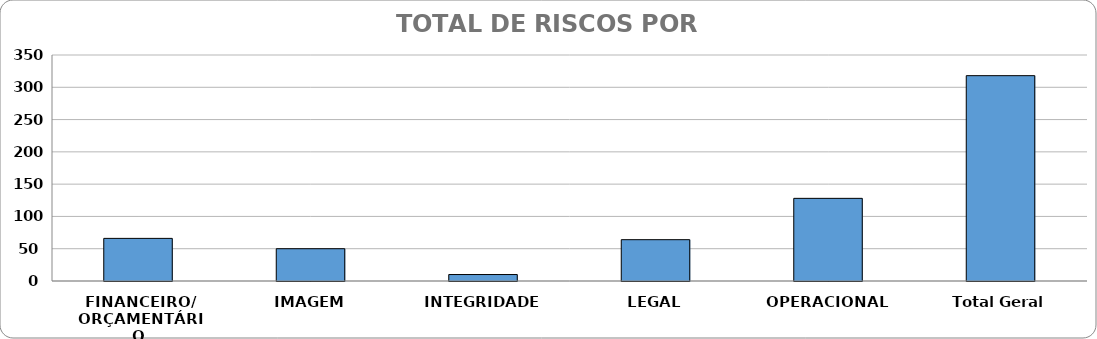
| Category | Total |
|---|---|
| FINANCEIRO/ ORÇAMENTÁRIO | 66 |
| IMAGEM | 50 |
| INTEGRIDADE | 10 |
| LEGAL | 64 |
| OPERACIONAL | 128 |
| Total Geral | 318 |